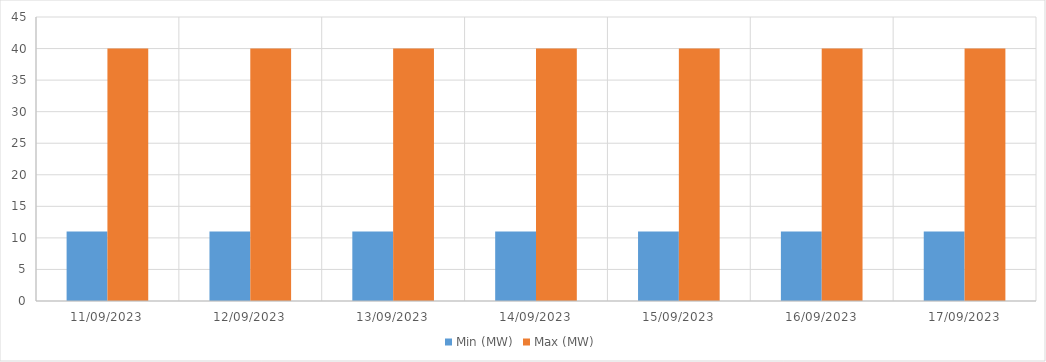
| Category | Min (MW) | Max (MW) |
|---|---|---|
| 11/09/2023 | 11 | 40 |
| 12/09/2023 | 11 | 40 |
| 13/09/2023 | 11 | 40 |
| 14/09/2023 | 11 | 40 |
| 15/09/2023 | 11 | 40 |
| 16/09/2023 | 11 | 40 |
| 17/09/2023 | 11 | 40 |